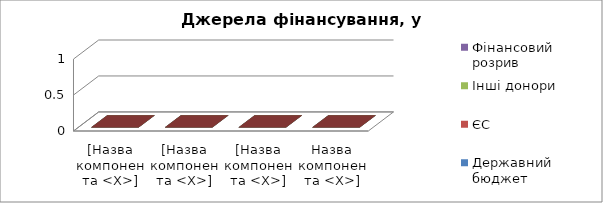
| Category |  Державний бюджет  |  ЄС  |  Інші донори  |  Фінансовий розрив  |
|---|---|---|---|---|
| [Назва компонента <X>] | 0 | 0 | 0 | 0 |
| [Назва компонента <X>] | 0 | 0 | 0 | 0 |
| [Назва компонента <X>] | 0 | 0 | 0 | 0 |
| Назва компонента <X>] | 0 | 0 | 0 | 0 |